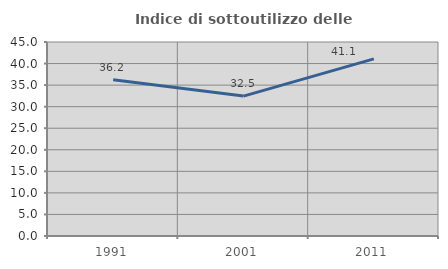
| Category | Indice di sottoutilizzo delle abitazioni  |
|---|---|
| 1991.0 | 36.226 |
| 2001.0 | 32.458 |
| 2011.0 | 41.091 |